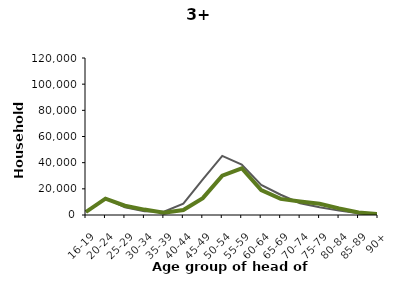
| Category | Series 0 | Series 1 |
|---|---|---|
| 16-19 | 2202 | 2377 |
| 20-24 | 12810 | 12463 |
| 25-29 | 5843 | 7105 |
| 30-34 | 2929 | 4127 |
| 35-39 | 2538 | 1779 |
| 40-44 | 8728 | 3850 |
| 45-49 | 27206 | 12880 |
| 50-54 | 45175 | 30034 |
| 55-59 | 38586 | 35716 |
| 60-64 | 23062 | 18982 |
| 65-69 | 15471 | 12298 |
| 70-74 | 9045 | 10301 |
| 75-79 | 6004 | 8618 |
| 80-84 | 3347 | 5036 |
| 85-89 | 1266 | 1857 |
| 90+ | 424 | 763 |